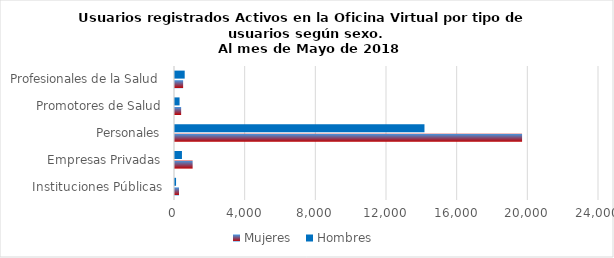
| Category | Mujeres | Hombres |
|---|---|---|
| Instituciones Públicas | 225 | 60 |
| Empresas Privadas | 998 | 393 |
| Personales | 19646 | 14121 |
| Promotores de Salud | 348 | 258 |
| Profesionales de la Salud | 460 | 549 |